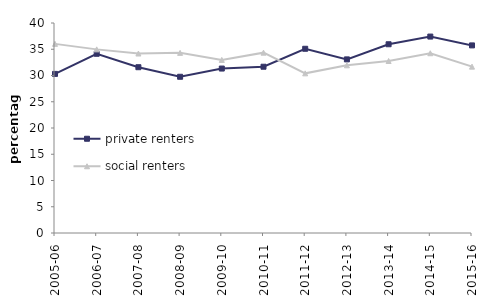
| Category | private renters | social renters |
|---|---|---|
| 2005-06 | 30.306 | 36.025 |
| 2006-07 | 34.134 | 34.976 |
| 2007-08 | 31.578 | 34.186 |
| 2008-09 | 29.759 | 34.312 |
| 2009-10 | 31.324 | 32.966 |
| 2010-11 | 31.671 | 34.351 |
| 2011-12 | 35.091 | 30.411 |
| 2012-13 | 33.07 | 31.941 |
| 2013-14 | 35.952 | 32.76 |
| 2014-15 | 37.414 | 34.239 |
| 2015-16 | 35.735 | 31.689 |